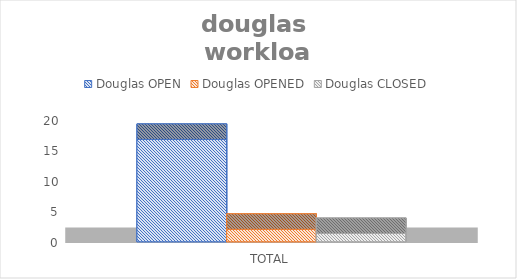
| Category | Douglas |
|---|---|
| TOTAL | 1.356 |